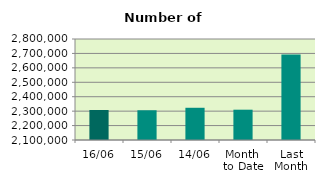
| Category | Series 0 |
|---|---|
| 16/06 | 2308092 |
| 15/06 | 2306080 |
| 14/06 | 2323354 |
| Month 
to Date | 2310047.167 |
| Last
Month | 2692139.333 |